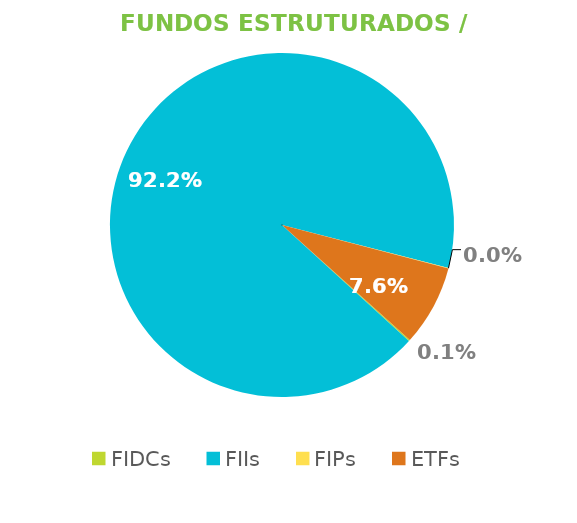
| Category | Fundos Estruturados / ETFs |
|---|---|
| FIDCs | 0.001 |
| FIIs | 0.922 |
| FIPs | 0 |
| ETFs | 0.076 |